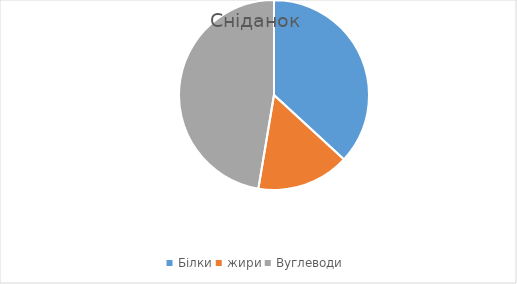
| Category | Сніданок |
|---|---|
| Білки | 35 |
| жири | 15 |
| Вуглеводи | 45 |